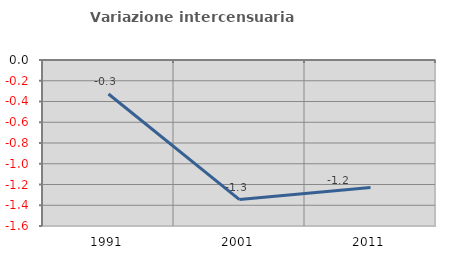
| Category | Variazione intercensuaria annua |
|---|---|
| 1991.0 | -0.327 |
| 2001.0 | -1.345 |
| 2011.0 | -1.23 |